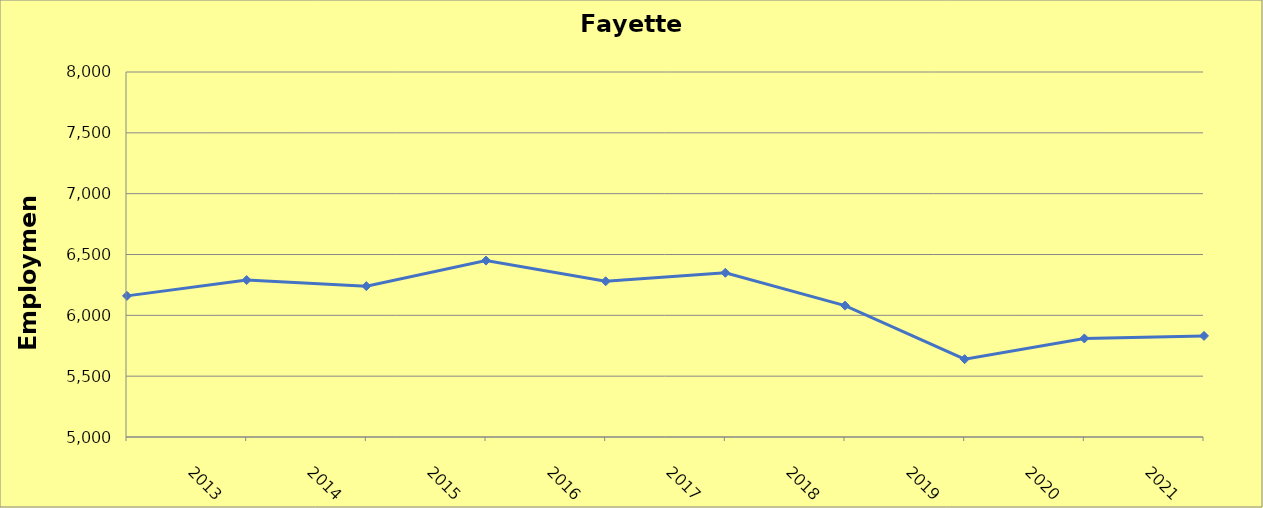
| Category | Fayette County |
|---|---|
| 2013.0 | 6160 |
| 2014.0 | 6290 |
| 2015.0 | 6240 |
| 2016.0 | 6450 |
| 2017.0 | 6280 |
| 2018.0 | 6350 |
| 2019.0 | 6080 |
| 2020.0 | 5640 |
| 2021.0 | 5810 |
| 2022.0 | 5831 |